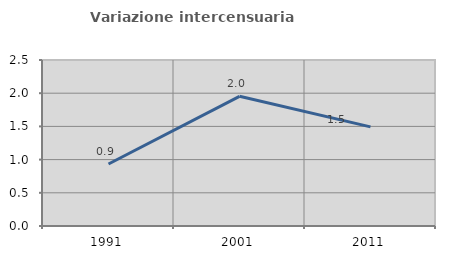
| Category | Variazione intercensuaria annua |
|---|---|
| 1991.0 | 0.934 |
| 2001.0 | 1.953 |
| 2011.0 | 1.493 |